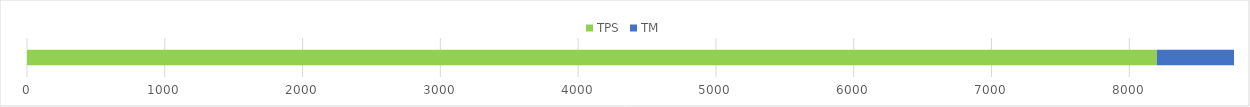
| Category | TPS | TM |
|---|---|---|
| 0 | 8200 | 560 |